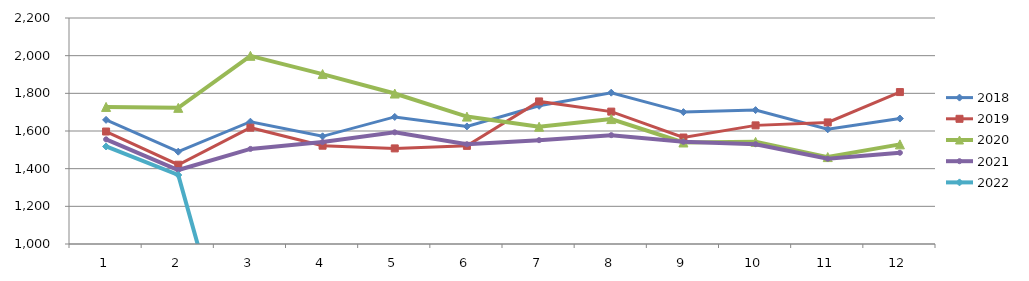
| Category | 2018 | 2019 | 2020 | 2021 | 2022 |
|---|---|---|---|---|---|
| 0 | 1659.233 | 1597.182 | 1727.767 | 1555.724 | 1517.795 |
| 1 | 1490.116 | 1420.981 | 1722.949 | 1392.893 | 1366.356 |
| 2 | 1649.429 | 1617.601 | 1999.15 | 1504.855 | 0 |
| 3 | 1571.732 | 1521.999 | 1902.268 | 1541.039 | 0 |
| 4 | 1674.727 | 1507.654 | 1798.925 | 1592.865 | 0 |
| 5 | 1624.201 | 1521.033 | 1676.477 | 1529.566 | 0 |
| 6 | 1733.621 | 1757.049 | 1622.712 | 1551.412 | 0 |
| 7 | 1803.444 | 1702.894 | 1663.262 | 1577.956 | 0 |
| 8 | 1700.265 | 1565.361 | 1539.017 | 1542.78 | 0 |
| 9 | 1710.862 | 1629.894 | 1542.307 | 1529.928 | 0 |
| 10 | 1609.178 | 1645.62 | 1461.483 | 1452.733 | 0 |
| 11 | 1666.129 | 1806.739 | 1529.116 | 1484.399 | 0 |